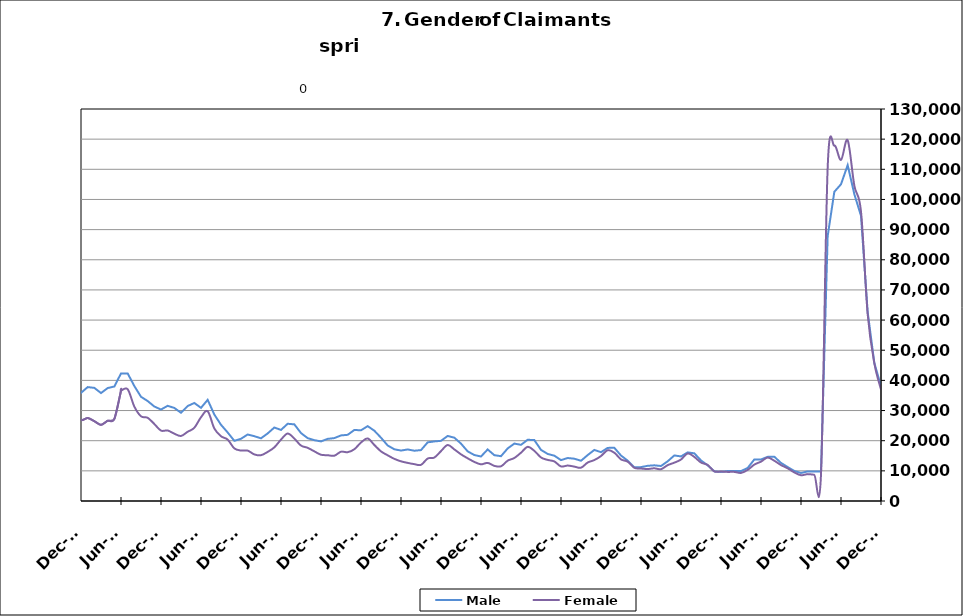
| Category | Male | Female |
|---|---|---|
| 1995-02-28 | 11910 | 7689 |
| 1995-03-31 | 12528 | 7887 |
| 1995-04-30 | 14119 | 8295 |
| 1995-05-31 | 15153 | 8659 |
| 1995-06-30 | 14654 | 9963 |
| 1995-07-31 | 16478 | 11435 |
| 1995-08-31 | 16264 | 11011 |
| 1995-09-30 | 13352 | 9104 |
| 1995-10-31 | 11499 | 8670 |
| 1995-11-30 | 10418 | 7960 |
| 1995-12-31 | 11010 | 7787 |
| 1996-01-31 | 11539 | 7863 |
| 1996-02-29 | 12768 | 7894 |
| 1996-03-31 | 13246 | 7755 |
| 1996-04-30 | 16021 | 8296 |
| 1996-05-31 | 15929 | 8751 |
| 1996-06-30 | 15291 | 10224 |
| 1996-07-31 | 17229 | 11535 |
| 1996-08-31 | 16317 | 10611 |
| 1996-09-30 | 13793 | 8812 |
| 1996-10-31 | 11431 | 8215 |
| 1996-11-30 | 10510 | 7751 |
| 1996-12-31 | 10023 | 7185 |
| 1997-01-31 | 12006 | 7404 |
| 1997-02-28 | 11976 | 7384 |
| 1997-03-31 | 11924 | 7078 |
| 1997-04-30 | 13098 | 7454 |
| 1997-05-31 | 13763 | 8032 |
| 1997-06-30 | 12872 | 9377 |
| 1997-07-31 | 15358 | 10550 |
| 1997-08-31 | 14888 | 9776 |
| 1997-09-30 | 12307 | 8016 |
| 1997-10-31 | 10749.5 | 7444 |
| 1997-11-30 | 9192 | 6872 |
| 1997-12-31 | 8541 | 6180 |
| 1998-01-31 | 9230 | 6563 |
| 1998-02-28 | 9286 | 6048 |
| 1998-03-31 | 9805 | 6012 |
| 1998-04-30 | 12254 | 7080 |
| 1998-05-31 | 13029 | 7509 |
| 1998-06-30 | 12376 | 9201 |
| 1998-07-31 | 14264 | 10448 |
| 1998-08-31 | 14319 | 9908 |
| 1998-09-30 | 12515 | 8202 |
| 1998-10-31 | 9927 | 7502 |
| 1998-11-30 | 9481 | 7563 |
| 1998-12-31 | 9422 | 7289 |
| 1999-01-31 | 10826 | 7829 |
| 1999-02-28 | 10614 | 7417 |
| 1999-03-31 | 10596 | 7180 |
| 1999-04-30 | 14139 | 8377 |
| 1999-05-31 | 14748 | 8508 |
| 1999-06-30 | 13399 | 9753 |
| 1999-07-31 | 16831 | 11294 |
| 1999-08-31 | 17466 | 10502 |
| 1999-09-30 | 14075 | 8356 |
| 1999-10-31 | 11344 | 7743 |
| 1999-11-30 | 10401 | 7623 |
| 1999-12-31 | 9702 | 6793 |
| 2000-01-31 | 10263 | 7252 |
| 2000-02-29 | 10217 | 7054 |
| 2000-03-31 | 10848 | 6860 |
| 2000-04-30 | 13099 | 8062 |
| 2000-05-31 | 13692 | 8388 |
| 2000-06-30 | 13498 | 10306 |
| 2000-07-31 | 15682 | 11874 |
| 2000-08-31 | 15407 | 10967 |
| 2000-09-30 | 12230 | 8808 |
| 2000-10-31 | 10182 | 8230 |
| 2000-11-30 | 9376 | 8049 |
| 2000-12-31 | 9229 | 7777 |
| 2001-01-31 | 10264 | 8400 |
| 2001-02-28 | 11709 | 8801 |
| 2001-03-31 | 9919 | 7036 |
| 2001-04-30 | 17255 | 11559 |
| 2001-05-31 | 18656 | 12219 |
| 2001-06-30 | 19590 | 15536 |
| 2001-07-31 | 22235 | 17388 |
| 2001-08-31 | 22550 | 16255 |
| 2001-09-30 | 20719 | 15193 |
| 2001-10-31 | 20761 | 15705 |
| 2001-11-30 | 22570 | 16084 |
| 2001-12-31 | 24429 | 16497 |
| 2002-01-31 | 26188 | 17125 |
| 2002-02-28 | 27071 | 16705 |
| 2002-03-31 | 26691 | 16475 |
| 2002-04-30 | 32125 | 20940 |
| 2002-05-31 | 31589 | 20115 |
| 2002-06-30 | 30220 | 21952 |
| 2002-07-31 | 30981 | 23132 |
| 2002-08-31 | 23858 | 16993 |
| 2002-09-30 | 27757 | 19832 |
| 2002-10-31 | 25023 | 18451 |
| 2002-11-30 | 24331 | 17763 |
| 2002-12-31 | 24361 | 17175 |
| 2003-01-31 | 24361 | 17175 |
| 2003-02-28 | 26133 | 17155 |
| 2003-03-31 | 26934 | 17491 |
| 2003-04-30 | 29393 | 19122 |
| 2003-05-31 | 30480 | 19811 |
| 2003-06-30 | 30177 | 22643 |
| 2003-07-31 | 30615 | 23565 |
| 2003-08-31 | 29860 | 22195 |
| 2003-09-30 | 26777 | 19925 |
| 2003-10-31 | 23899 | 18782 |
| 2003-11-30 | 22247 | 17944 |
| 2003-12-31 | 20902 | 16829 |
| 2004-01-31 | 20479 | 15794 |
| 2004-02-29 | 18869 | 14174 |
| 2004-03-31 | 18157 | 13452 |
| 2004-04-30 | 20525 | 14655 |
| 2004-05-31 | 20588 | 14975 |
| 2004-06-30 | 20148 | 17494 |
| 2004-07-31 | 22098 | 19064 |
| 2004-08-31 | 20778 | 16925 |
| 2004-09-30 | 17457 | 14258 |
| 2004-10-31 | 15548 | 13549 |
| 2004-11-30 | 14919 | 12836 |
| 2004-12-31 | 14200 | 11711 |
| 2005-01-31 | 14968 | 11918 |
| 2005-02-28 | 14478 | 11045 |
| 2005-03-31 | 13958 | 10426 |
| 2005-04-30 | 15898 | 11682 |
| 2005-05-31 | 16188 | 11900 |
| 2005-06-30 | 15549 | 14256 |
| 2005-07-31 | 16728 | 15274 |
| 2005-08-31 | 16418 | 13314 |
| 2005-09-30 | 12729 | 10857 |
| 2005-10-31 | 11493 | 10421 |
| 2005-11-30 | 10480 | 9638 |
| 2005-12-31 | 9482 | 8742 |
| 2006-01-31 | 9638 | 8761 |
| 2006-02-28 | 8844 | 7847 |
| 2006-03-31 | 9353 | 7709 |
| 2006-04-30 | 11916 | 9300 |
| 2006-05-31 | 12755 | 10017 |
| 2006-06-30 | 12840 | 12614 |
| 2006-07-31 | 14534 | 14007 |
| 2006-08-31 | 14510 | 12902 |
| 2006-09-30 | 12359 | 10850 |
| 2006-10-31 | 11360 | 10309 |
| 2006-11-30 | 10702 | 9403 |
| 2006-12-31 | 10886 | 9298 |
| 2007-01-31 | 11619 | 9539 |
| 2007-02-28 | 12137 | 9112 |
| 2007-03-31 | 12434 | 9125 |
| 2007-04-30 | 14864 | 10520 |
| 2007-05-31 | 16656 | 11730 |
| 2007-06-30 | 16711 | 14024 |
| 2007-07-31 | 18458 | 15882 |
| 2007-08-31 | 17879 | 14187 |
| 2007-09-30 | 16538 | 13586 |
| 2007-10-31 | 15458 | 13070 |
| 2007-11-15 | 14626 | 12172 |
| 2007-12-15 09:36:00 | 15625 | 12363 |
| 2008-01-14 19:12:00 | 17236 | 12936 |
| 2008-02-14 04:48:00 | 18262 | 12696 |
| 2008-03-15 14:24:00 | 19119 | 13263 |
| 2008-04-15 | 22039 | 15054 |
| 2008-05-15 09:36:00 | 24402 | 16733 |
| 2008-06-14 19:12:00 | 25155 | 19969 |
| 2008-07-15 04:48:00 | 27499 | 22268 |
| 2008-08-14 14:24:00 | 29286 | 21514 |
| 2008-09-14 | 30571 | 21776 |
| 2008-10-14 09:36:00 | 32282 | 22190 |
| 2008-11-13 19:12:00 | 36325 | 23395 |
| 2008-12-14 04:48:00 | 42012 | 25046 |
| 2009-01-13 14:24:00 | 49131 | 27148 |
| 2009-02-13 | 56509 | 29774 |
| 2009-03-15 09:36:00 | 63334 | 33788 |
| 2009-04-14 19:12:00 | 69062 | 36842 |
| 2009-05-15 04:48:00 | 69914 | 37773 |
| 2009-06-14 14:24:00 | 69512 | 42787 |
| 2009-07-15 | 71226 | 46347 |
| 2009-08-14 09:36:00 | 68777 | 43130 |
| 2009-09-13 19:12:00 | 65993 | 41526 |
| 2009-10-14 04:48:00 | 62480 | 40217 |
| 2009-11-13 14:24:00 | 60354 | 38454 |
| 2009-12-14 | 59507 | 36101 |
| 2010-01-13 09:36:00 | 58501 | 35014 |
| 2010-02-12 19:12:00 | 55590 | 32911 |
| 2010-03-15 04:48:00 | 53238 | 31883 |
| 2010-04-14 14:24:00 | 52264 | 32995 |
| 2010-05-15 | 50301 | 32394 |
| 2010-06-14 09:36:00 | 48130 | 36605 |
| 2010-07-14 19:12:00 | 48060 | 38748 |
| 2010-08-14 04:48:00 | 46311 | 35599 |
| 2010-09-13 14:24:00 | 41641 | 32453 |
| 2010-10-14 | 40403 | 32335 |
| 2010-11-13 09:36:00 | 38250 | 30275 |
| 2010-12-13 19:12:00 | 35858 | 26887 |
| 2011-01-13 04:48:00 | 37777 | 27522 |
| 2011-02-12 14:24:00 | 37515 | 26470 |
| 2011-03-15 | 35802 | 25248 |
| 2011-04-14 09:36:00 | 37452 | 26608 |
| 2011-05-14 19:12:00 | 37975 | 27212 |
| 2011-06-14 04:48:00 | 42289 | 36578 |
| 2011-07-14 14:24:00 | 42307 | 37061 |
| 2011-08-14 | 38125 | 31317 |
| 2011-09-13 09:36:00 | 34564 | 28090 |
| 2011-10-13 19:12:00 | 33146 | 27591 |
| 2011-11-13 04:48:00 | 31337 | 25538 |
| 2011-12-13 14:24:00 | 30334 | 23349 |
| 2012-01-13 | 31566 | 23385 |
| 2012-02-12 09:36:00 | 30859 | 22326 |
| 2012-03-13 19:12:00 | 29261 | 21568 |
| 2012-04-13 04:48:00 | 31494 | 22964 |
| 2012-05-13 14:24:00 | 32509 | 24284 |
| 2012-06-13 | 30900 | 27768 |
| 2012-07-13 09:36:00 | 33549 | 29756 |
| 2012-08-12 19:12:00 | 28663 | 24059 |
| 2012-09-12 04:48:00 | 25271 | 21482 |
| 2012-10-12 14:24:00 | 22730 | 20363 |
| 2012-11-12 | 19953 | 17450 |
| 2012-12-12 09:36:00 | 20635 | 16737 |
| 2013-01-11 19:12:00 | 22057 | 16712 |
| 2013-02-11 04:48:00 | 21486 | 15451 |
| 2013-03-13 14:24:00 | 20791 | 15186 |
| 2013-04-13 | 22409 | 16286 |
| 2013-05-13 09:36:00 | 24366 | 17794 |
| 2013-06-12 19:12:00 | 23573 | 20360 |
| 2013-07-13 04:48:00 | 25613 | 22369 |
| 2013-08-12 14:24:00 | 25420 | 20697 |
| 2013-09-12 | 22525 | 18385 |
| 2013-10-12 09:36:00 | 20848 | 17632 |
| 2013-11-11 19:12:00 | 20174 | 16466 |
| 2013-12-12 04:48:00 | 19765 | 15343 |
| 2014-01-11 14:24:00 | 20604 | 15183 |
| 2014-02-11 | 20864 | 15026 |
| 2014-03-13 09:36:00 | 21751 | 16343 |
| 2014-04-12 19:12:00 | 21948 | 16190 |
| 2014-05-13 04:48:00 | 23554 | 17163 |
| 2014-06-12 14:24:00 | 23446 | 19393 |
| 2014-07-13 | 24827 | 20751 |
| 2014-08-14 | 23315 | 18575 |
| 2014-09-13 09:36:00 | 20988 | 16453 |
| 2014-10-13 19:12:00 | 18411 | 15157 |
| 2014-11-13 04:48:00 | 17155 | 13975 |
| 2014-12-13 14:24:00 | 16727 | 13162 |
| 2015-01-13 | 17097 | 12633 |
| 2015-02-12 09:36:00 | 16674 | 12222 |
| 2015-03-14 19:12:00 | 16878 | 11988 |
| 2015-04-14 04:48:00 | 19448 | 14078 |
| 2015-05-14 14:24:00 | 19759 | 14413 |
| 2015-06-14 | 19952 | 16548 |
| 2015-07-14 09:36:00 | 21569 | 18572 |
| 2015-08-13 19:12:00 | 21001 | 17106 |
| 2015-09-13 04:48:00 | 19028 | 15475 |
| 2015-10-13 14:24:00 | 16459 | 14160 |
| 2015-11-13 | 15246 | 12968 |
| 2015-12-13 09:36:00 | 14756 | 12166 |
| 2016-01-12 19:12:00 | 17097 | 12633 |
| 2016-02-12 04:48:00 | 15198 | 11659 |
| 2016-03-13 14:24:00 | 14862 | 11506 |
| 2016-04-13 | 17432 | 13364 |
| 2016-05-13 09:36:00 | 19040 | 14264 |
| 2016-06-12 19:12:00 | 18628 | 16024 |
| 2016-07-13 04:48:00 | 20305 | 17959 |
| 2016-08-12 14:24:00 | 20204 | 16625 |
| 2016-09-12 | 16946 | 14443 |
| 2016-10-12 09:36:00 | 15612 | 13624 |
| 2016-11-11 19:12:00 | 15023 | 13122 |
| 2016-12-12 04:48:00 | 13560 | 11454 |
| 2017-01-11 14:24:00 | 14257 | 11754 |
| 2017-02-11 | 14028 | 11405 |
| 2017-03-13 09:36:00 | 13342 | 11038 |
| 2017-04-12 19:12:00 | 15225 | 12749 |
| 2017-05-13 04:48:00 | 16938 | 13582 |
| 2017-06-12 14:24:00 | 16188 | 14911 |
| 2017-07-13 | 17613 | 16845 |
| 2017-08-12 09:36:00 | 17640 | 16005 |
| 2017-09-11 19:12:00 | 15075 | 13806 |
| 2017-10-12 04:48:00 | 13384 | 13044 |
| 2017-11-11 14:24:00 | 11160 | 11015 |
| 2017-12-12 | 11238 | 10767 |
| 2018-01-11 09:36:00 | 11674 | 10594 |
| 2018-02-10 19:12:00 | 11835 | 10845 |
| 2018-03-13 04:48:00 | 11605 | 10548 |
| 2018-04-12 14:24:00 | 13162 | 11886 |
| 2018-05-13 | 15110 | 12712 |
| 2018-06-12 09:36:00 | 14782 | 13754 |
| 2018-07-12 19:12:00 | 16123 | 15773 |
| 2018-08-12 04:48:00 | 15808 | 14614 |
| 2018-09-11 14:24:00 | 13450 | 12761 |
| 2018-10-12 | 11831 | 11941 |
| 2018-11-11 09:36:00 | 9820 | 9821 |
| 2018-12-11 19:12:00 | 9649 | 9767 |
| 2019-01-11 04:48:00 | 9933 | 9654 |
| 2019-02-10 14:24:00 | 9925 | 9651 |
| 2019-03-13 | 9922 | 9318 |
| 2019-04-12 09:36:00 | 10950 | 10320 |
| 2019-05-12 19:12:00 | 13782 | 12072 |
| 2019-06-12 04:48:00 | 13767 | 13063 |
| 2019-07-12 14:24:00 | 14644 | 14409 |
| 2019-08-12 | 14678 | 13343 |
| 2019-09-11 09:36:00 | 12637 | 11915 |
| 2019-10-11 19:12:00 | 11254 | 10847 |
| 2019-11-11 04:48:00 | 9954 | 9467 |
| 2019-12-11 14:24:00 | 9289 | 8549 |
| 2020-01-11 | 9815 | 8911 |
| 2020-02-10 09:36:00 | 9754 | 8723 |
| 2020-03-11 19:12:00 | 9805 | 8802 |
| 2020-04-11 04:48:00 | 87837 | 110534 |
| 2020-05-11 14:24:00 | 102538 | 117856 |
| 2020-06-11 | 105039 | 113108 |
| 2020-07-11 09:36:00 | 111386 | 119644 |
| 2020-08-10 19:12:00 | 101758 | 104593 |
| 2020-09-10 04:48:00 | 94558 | 95979 |
| 2020-10-10 14:24:00 | 62680 | 62005 |
| 2020-11-10 | 45770 | 45707 |
| 2020-12-10 09:36:00 | 38071 | 36983 |